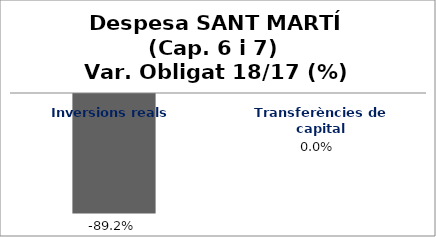
| Category | Series 0 |
|---|---|
| Inversions reals | -0.892 |
| Transferències de capital | 0 |